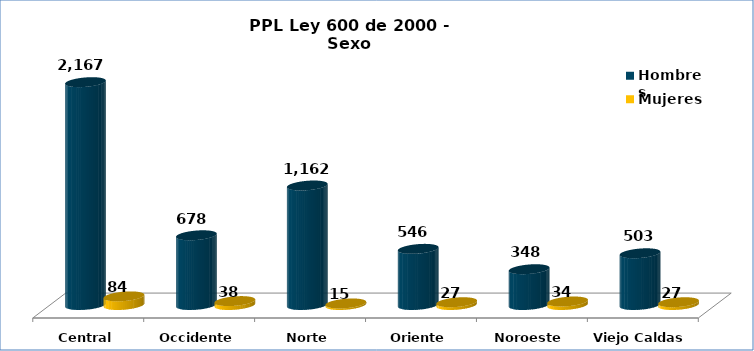
| Category | Hombres | Mujeres |
|---|---|---|
| Central | 2167 | 84 |
| Occidente | 678 | 38 |
| Norte | 1162 | 15 |
| Oriente | 546 | 27 |
| Noroeste | 348 | 34 |
| Viejo Caldas | 503 | 27 |